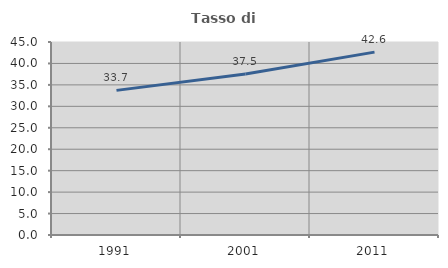
| Category | Tasso di occupazione   |
|---|---|
| 1991.0 | 33.721 |
| 2001.0 | 37.548 |
| 2011.0 | 42.643 |